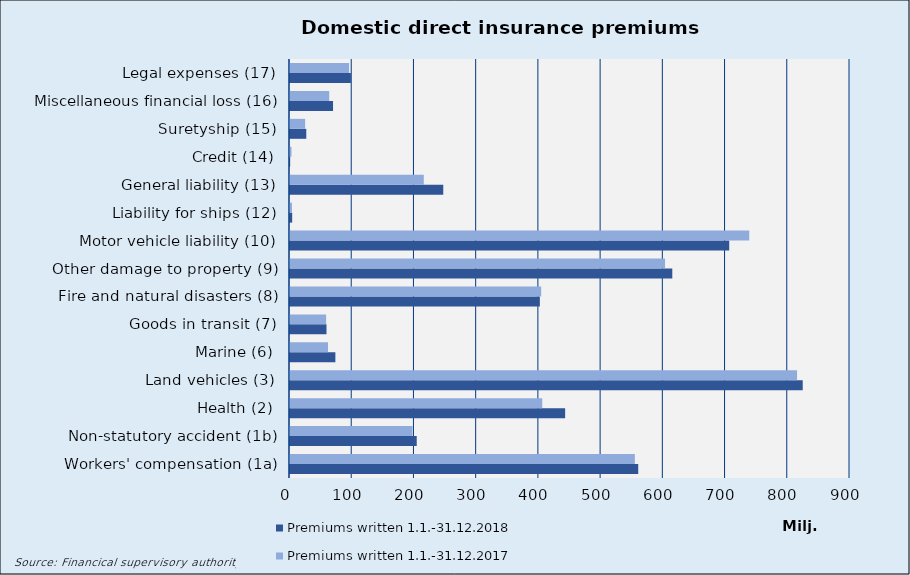
| Category | Premiums written |
|---|---|
| Workers' compensation (1a) | 554225.637 |
| Non-statutory accident (1b) | 196846.354 |
| Health (2) | 405364.067 |
| Land vehicles (3) | 814938.211 |
| Marine (6) | 61117.599 |
| Goods in transit (7) | 58074.63 |
| Fire and natural disasters (8) | 403686.09 |
| Other damage to property (9) | 602744.738 |
| Motor vehicle liability (10) | 738080.982 |
| Liability for ships (12) | 3152.309 |
| General liability (13) | 215008.232 |
| Credit (14) | 2376.358 |
| Suretyship (15) | 24324.75 |
| Miscellaneous financial loss (16) | 63027.609 |
| Legal expenses (17) | 94921.496 |